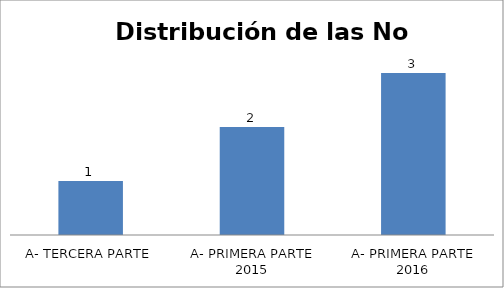
| Category | Series 0 |
|---|---|
| A- TERCERA PARTE | 1 |
| A- PRIMERA PARTE 2015 | 2 |
| A- PRIMERA PARTE 2016 | 3 |